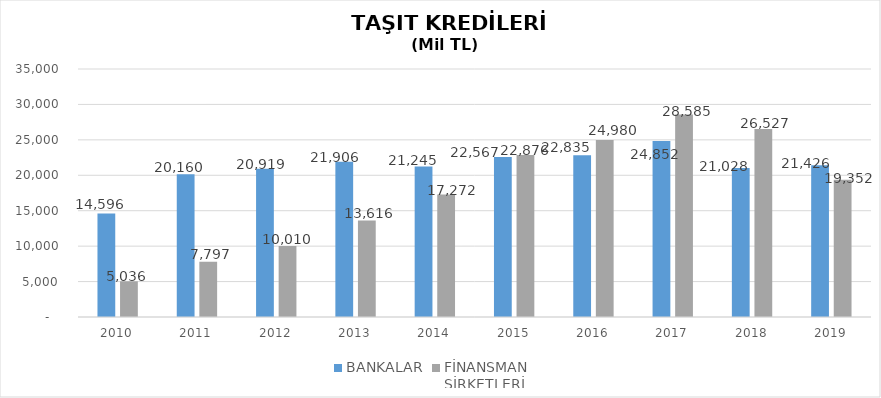
| Category | BANKALAR | FİNANSMAN 
ŞİRKETLERİ |
|---|---|---|
| 2010.0 | 14596 | 5035.89 |
| 2011.0 | 20160 | 7796.854 |
| 2012.0 | 20919 | 10009.755 |
| 2013.0 | 21906 | 13616.036 |
| 2014.0 | 21245 | 17271.844 |
| 2015.0 | 22567 | 22875.563 |
| 2016.0 | 22835 | 24980.231 |
| 2017.0 | 24852 | 28584.938 |
| 2018.0 | 21028 | 26527.133 |
| 2019.0 | 21426.2 | 19352.327 |